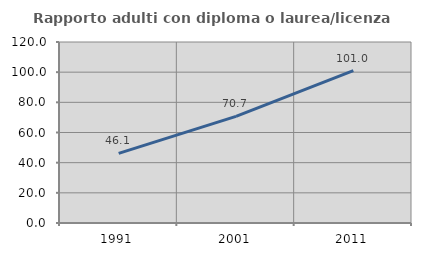
| Category | Rapporto adulti con diploma o laurea/licenza media  |
|---|---|
| 1991.0 | 46.125 |
| 2001.0 | 70.728 |
| 2011.0 | 101.029 |